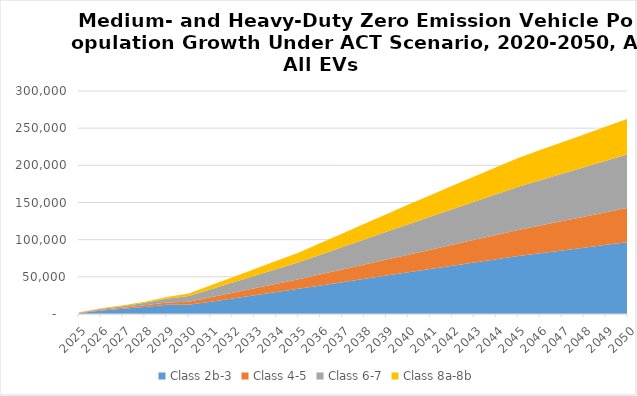
| Category | Class 2b-3 | Class 4-5 | Class 6-7 | Class 8a-8b |
|---|---|---|---|---|
| 2025.0 | 1156.966 | 391.266 | 584.406 | 307.603 |
| 2026.0 | 4862.012 | 837.629 | 1289.34 | 656.725 |
| 2027.0 | 7007.064 | 1372.535 | 2175.631 | 1070.496 |
| 2028.0 | 9527.681 | 2093.145 | 3414.266 | 1587.845 |
| 2029.0 | 12481.959 | 3040.576 | 5100.308 | 2237.762 |
| 2030.0 | 12283.646 | 4318.708 | 7444.883 | 3596.206 |
| 2031.0 | 16601.684 | 6046.983 | 10487.679 | 5480.867 |
| 2032.0 | 20919.723 | 7775.259 | 13530.474 | 7365.529 |
| 2033.0 | 25237.761 | 9503.534 | 16573.27 | 9250.19 |
| 2034.0 | 29555.799 | 11231.809 | 19616.065 | 11134.852 |
| 2035.0 | 33873.838 | 12960.084 | 22658.861 | 13019.513 |
| 2036.0 | 38358.656 | 15067.631 | 26316.186 | 15730.501 |
| 2037.0 | 42843.473 | 17175.177 | 29973.51 | 18441.489 |
| 2038.0 | 47328.291 | 19282.724 | 33630.834 | 21152.476 |
| 2039.0 | 51813.109 | 21390.27 | 37288.159 | 23863.464 |
| 2040.0 | 56297.927 | 23497.817 | 40945.483 | 26574.451 |
| 2041.0 | 60625.286 | 25818.344 | 44377.49 | 29021.067 |
| 2042.0 | 64952.645 | 28138.871 | 47809.497 | 31467.682 |
| 2043.0 | 69280.005 | 30459.398 | 51241.503 | 33914.297 |
| 2044.0 | 73607.364 | 32779.925 | 54673.51 | 36360.913 |
| 2045.0 | 77934.723 | 35100.452 | 58105.516 | 38807.528 |
| 2046.0 | 81715.471 | 37274.884 | 60893.612 | 40615.312 |
| 2047.0 | 85496.219 | 39449.315 | 63681.708 | 42423.096 |
| 2048.0 | 89276.967 | 41623.747 | 66469.804 | 44230.88 |
| 2049.0 | 93057.715 | 43798.179 | 69257.9 | 46038.664 |
| 2050.0 | 96838.462 | 45972.611 | 72045.996 | 47846.448 |